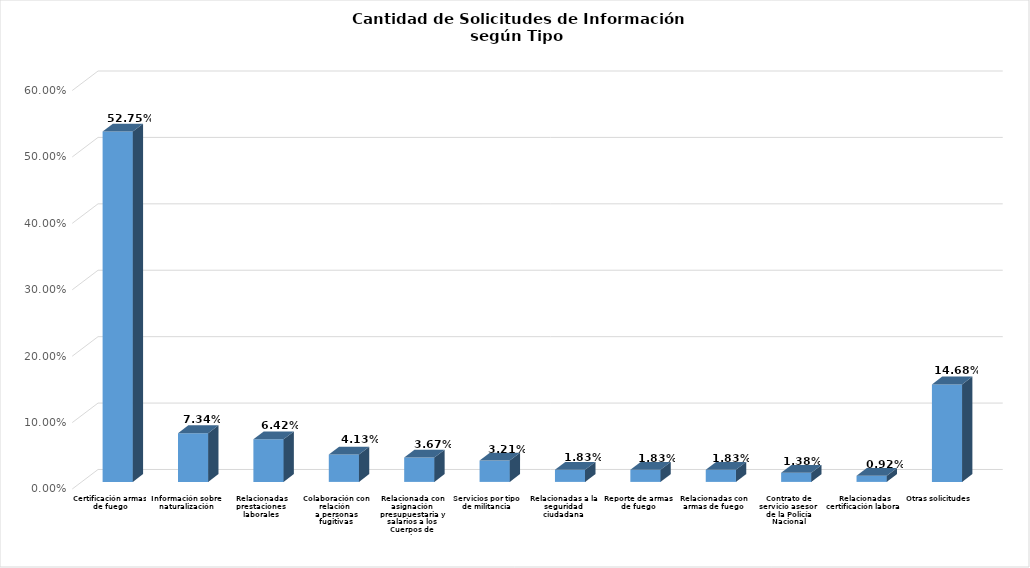
| Category | Series 0 |
|---|---|
| Certificación armas de fuego | 0.528 |
| Información sobre naturalización | 0.073 |
| Relacionadas prestaciones laborales | 0.064 |
| Colaboración con relación 
a personas fugitivas | 0.041 |
| Relacionada con asignación presupuestaria y salarios a los Cuerpos de Bomberos | 0.037 |
| Servicios por tipo de militancia | 0.032 |
| Relacionadas a la seguridad ciudadana | 0.018 |
| Reporte de armas de fuego | 0.018 |
| Relacionadas con armas de fuego | 0.018 |
| Contrato de servicio asesor 
de la Policía Nacional | 0.014 |
| Relacionadas certificación laboral | 0.009 |
| Otras solicitudes | 0.147 |